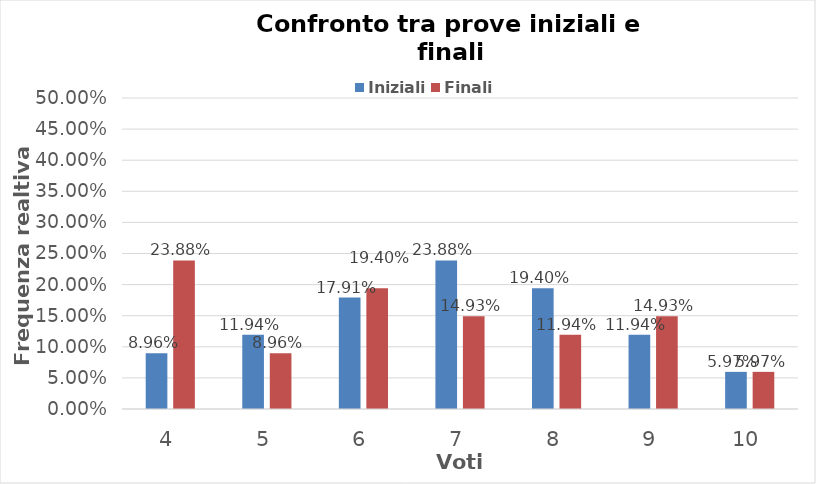
| Category | Iniziali | Finali |
|---|---|---|
| 4.0 | 0.09 | 0.239 |
| 5.0 | 0.119 | 0.09 |
| 6.0 | 0.179 | 0.194 |
| 7.0 | 0.239 | 0.149 |
| 8.0 | 0.194 | 0.119 |
| 9.0 | 0.119 | 0.149 |
| 10.0 | 0.06 | 0.06 |